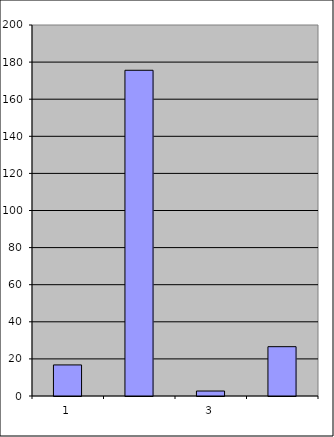
| Category | Series 0 |
|---|---|
| 0 | 16.75 |
| 1 | 175.597 |
| 2 | 2.681 |
| 3 | 26.591 |